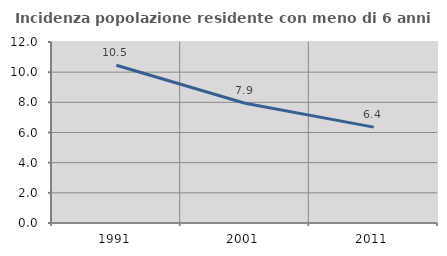
| Category | Incidenza popolazione residente con meno di 6 anni |
|---|---|
| 1991.0 | 10.456 |
| 2001.0 | 7.937 |
| 2011.0 | 6.355 |